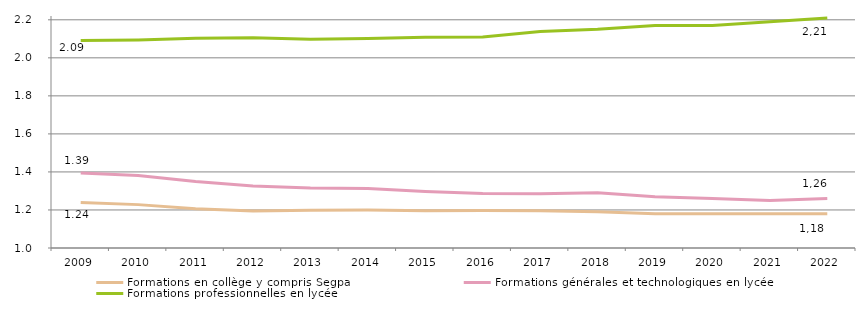
| Category | Formations en collège y compris Segpa | Formations générales et technologiques en lycée | Formations professionnelles en lycée |
|---|---|---|---|
| 2009.0 | 1.239 | 1.394 | 2.091 |
| 2010.0 | 1.228 | 1.382 | 2.094 |
| 2011.0 | 1.206 | 1.35 | 2.103 |
| 2012.0 | 1.194 | 1.326 | 2.105 |
| 2013.0 | 1.199 | 1.316 | 2.097 |
| 2014.0 | 1.2 | 1.313 | 2.102 |
| 2015.0 | 1.196 | 1.297 | 2.108 |
| 2016.0 | 1.198 | 1.286 | 2.11 |
| 2017.0 | 1.195 | 1.285 | 2.139 |
| 2018.0 | 1.19 | 1.29 | 2.15 |
| 2019.0 | 1.18 | 1.27 | 2.17 |
| 2020.0 | 1.18 | 1.26 | 2.17 |
| 2021.0 | 1.18 | 1.25 | 2.19 |
| 2022.0 | 1.18 | 1.26 | 2.21 |